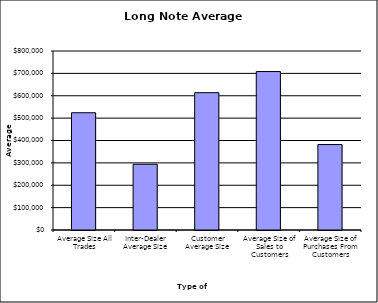
| Category | Security Type |
|---|---|
| Average Size All Trades | 524084.727 |
| Inter-Dealer Average Size | 293781.854 |
| Customer Average Size | 613665.052 |
| Average Size of Sales to Customers | 708183.969 |
| Average Size of Purchases From Customers | 381890.638 |